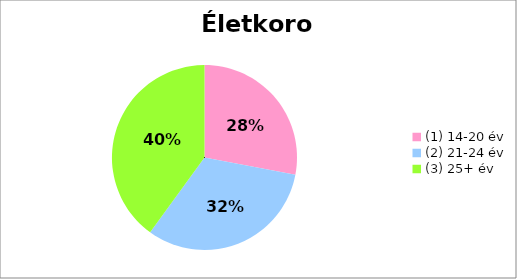
| Category | Series 0 | 7 8 10 |
|---|---|---|
| (1) 14-20 év | 7 |  |
| (2) 21-24 év | 8 |  |
| (3) 25+ év | 10 |  |